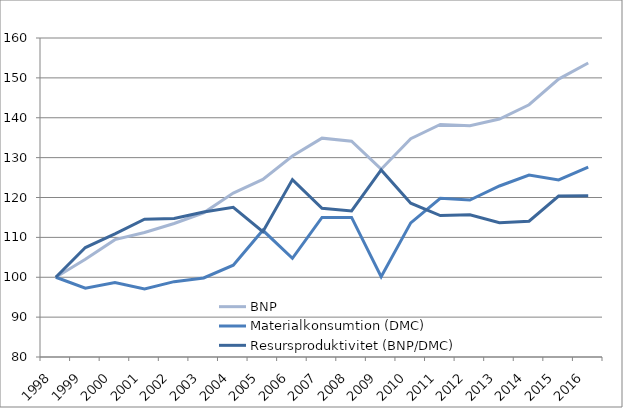
| Category | BNP | Materialkonsumtion (DMC) | Resursproduktivitet (BNP/DMC) |
|---|---|---|---|
| 1998.0 | 100 | 100 | 100 |
| 1999.0 | 104.491 | 97.24 | 107.457 |
| 2000.0 | 109.431 | 98.687 | 110.887 |
| 2001.0 | 111.228 | 97.091 | 114.56 |
| 2002.0 | 113.473 | 98.893 | 114.743 |
| 2003.0 | 116.168 | 99.827 | 116.369 |
| 2004.0 | 121.108 | 103.031 | 117.546 |
| 2005.0 | 124.551 | 111.775 | 111.43 |
| 2006.0 | 130.389 | 104.739 | 124.49 |
| 2007.0 | 134.88 | 115.004 | 117.283 |
| 2008.0 | 134.132 | 114.997 | 116.639 |
| 2009.0 | 127.096 | 100.141 | 126.916 |
| 2010.0 | 134.731 | 113.635 | 118.564 |
| 2011.0 | 138.323 | 119.79 | 115.472 |
| 2012.0 | 138.024 | 119.353 | 115.644 |
| 2013.0 | 139.671 | 122.892 | 113.653 |
| 2014.0 | 143.263 | 125.62 | 114.045 |
| 2015.0 | 149.701 | 124.39 | 120.347 |
| 2016.0 | 153.743 | 127.621 | 120.468 |